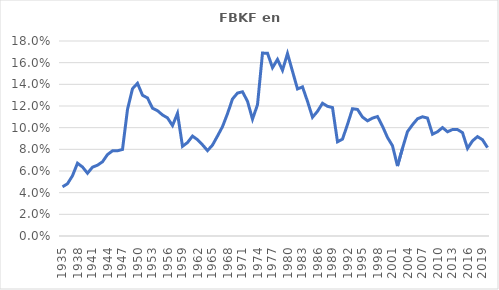
| Category | Construcciones |
|---|---|
| 1935.0 | 0.045 |
| 1936.0 | 0.048 |
| 1937.0 | 0.056 |
| 1938.0 | 0.067 |
| 1939.0 | 0.064 |
| 1940.0 | 0.058 |
| 1941.0 | 0.064 |
| 1942.0 | 0.065 |
| 1943.0 | 0.069 |
| 1944.0 | 0.075 |
| 1945.0 | 0.079 |
| 1946.0 | 0.079 |
| 1947.0 | 0.08 |
| 1948.0 | 0.117 |
| 1949.0 | 0.136 |
| 1950.0 | 0.141 |
| 1951.0 | 0.13 |
| 1952.0 | 0.127 |
| 1953.0 | 0.118 |
| 1954.0 | 0.116 |
| 1955.0 | 0.112 |
| 1956.0 | 0.109 |
| 1957.0 | 0.102 |
| 1958.0 | 0.113 |
| 1959.0 | 0.083 |
| 1960.0 | 0.086 |
| 1961.0 | 0.092 |
| 1962.0 | 0.089 |
| 1963.0 | 0.084 |
| 1964.0 | 0.079 |
| 1965.0 | 0.084 |
| 1966.0 | 0.092 |
| 1967.0 | 0.101 |
| 1968.0 | 0.113 |
| 1969.0 | 0.126 |
| 1970.0 | 0.132 |
| 1971.0 | 0.133 |
| 1972.0 | 0.124 |
| 1973.0 | 0.108 |
| 1974.0 | 0.121 |
| 1975.0 | 0.169 |
| 1976.0 | 0.169 |
| 1977.0 | 0.155 |
| 1978.0 | 0.163 |
| 1979.0 | 0.153 |
| 1980.0 | 0.168 |
| 1981.0 | 0.152 |
| 1982.0 | 0.136 |
| 1983.0 | 0.138 |
| 1984.0 | 0.124 |
| 1985.0 | 0.11 |
| 1986.0 | 0.115 |
| 1987.0 | 0.123 |
| 1988.0 | 0.12 |
| 1989.0 | 0.119 |
| 1990.0 | 0.087 |
| 1991.0 | 0.089 |
| 1992.0 | 0.103 |
| 1993.0 | 0.117 |
| 1994.0 | 0.117 |
| 1995.0 | 0.11 |
| 1996.0 | 0.106 |
| 1997.0 | 0.109 |
| 1998.0 | 0.11 |
| 1999.0 | 0.101 |
| 2000.0 | 0.091 |
| 2001.0 | 0.083 |
| 2002.0 | 0.065 |
| 2003.0 | 0.081 |
| 2004.0 | 0.096 |
| 2005.0 | 0.103 |
| 2006.0 | 0.108 |
| 2007.0 | 0.11 |
| 2008.0 | 0.109 |
| 2009.0 | 0.094 |
| 2010.0 | 0.096 |
| 2011.0 | 0.1 |
| 2012.0 | 0.096 |
| 2013.0 | 0.098 |
| 2014.0 | 0.098 |
| 2015.0 | 0.095 |
| 2016.0 | 0.081 |
| 2017.0 | 0.088 |
| 2018.0 | 0.092 |
| 2019.0 | 0.089 |
| 2020.0 | 0.082 |